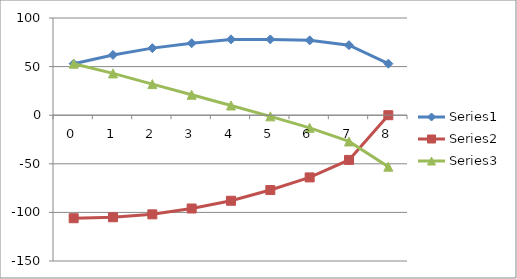
| Category | Series 0 | Series 1 | Series 2 |
|---|---|---|---|
| 0.0 | 53 | -106 | 53 |
| 1.0 | 62 | -105 | 43 |
| 2.0 | 69 | -102 | 32 |
| 3.0 | 74 | -96 | 21 |
| 4.0 | 78 | -88 | 10 |
| 5.0 | 78 | -77 | -1.2 |
| 6.0 | 77 | -64 | -13 |
| 7.0 | 72 | -46 | -27 |
| 8.0 | 53 | 0 | -53 |